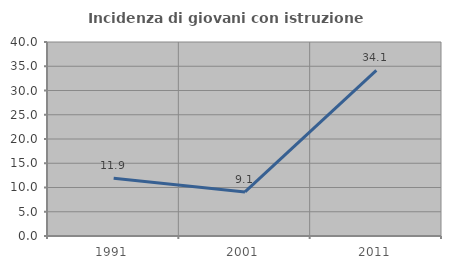
| Category | Incidenza di giovani con istruzione universitaria |
|---|---|
| 1991.0 | 11.905 |
| 2001.0 | 9.091 |
| 2011.0 | 34.146 |